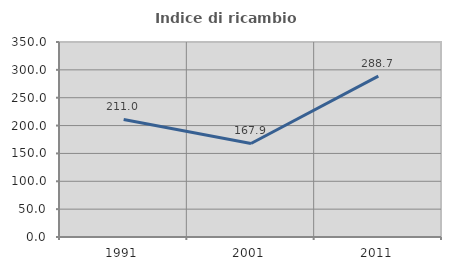
| Category | Indice di ricambio occupazionale  |
|---|---|
| 1991.0 | 210.959 |
| 2001.0 | 167.901 |
| 2011.0 | 288.71 |